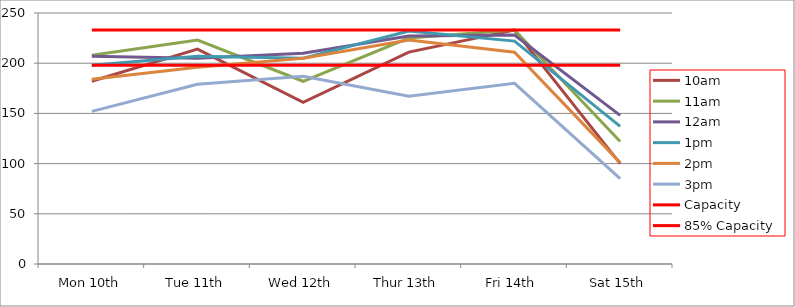
| Category | 9am | 10am | 11am | 12am | 1pm | 2pm | 3pm | 4pm | 5pm | Capacity | 85% Capacity |
|---|---|---|---|---|---|---|---|---|---|---|---|
| Mon 10th |  | 182 | 208 | 207 | 198 | 184 | 152 |  |  | 233 | 198 |
| Tue 11th |  | 214 | 223 | 205 | 207 | 196 | 179 |  |  | 233 | 198 |
| Wed 12th |  | 161 | 182 | 210 | 205 | 205 | 187 |  |  | 233 | 198 |
| Thur 13th |  | 211 | 225 | 227 | 232 | 223 | 167 |  |  | 233 | 198 |
| Fri 14th |  | 233 | 233 | 228 | 222 | 211 | 180 |  |  | 233 | 198 |
| Sat 15th |  | 100 | 122 | 148 | 137 | 101 | 85 |  |  | 233 | 198 |